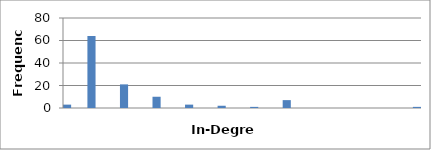
| Category | 3 |
|---|---|
| 0.0 | 3 |
| 0.2558139534883721 | 0 |
| 0.5116279069767442 | 0 |
| 0.7674418604651163 | 64 |
| 1.0232558139534884 | 0 |
| 1.2790697674418605 | 0 |
| 1.5348837209302326 | 0 |
| 1.7906976744186047 | 21 |
| 2.046511627906977 | 0 |
| 2.302325581395349 | 0 |
| 2.558139534883721 | 0 |
| 2.813953488372093 | 10 |
| 3.0697674418604652 | 0 |
| 3.3255813953488373 | 0 |
| 3.5813953488372094 | 0 |
| 3.8372093023255816 | 3 |
| 4.093023255813954 | 0 |
| 4.348837209302326 | 0 |
| 4.604651162790699 | 0 |
| 4.860465116279071 | 2 |
| 5.116279069767444 | 0 |
| 5.372093023255816 | 0 |
| 5.627906976744189 | 0 |
| 5.8837209302325615 | 1 |
| 6.139534883720934 | 0 |
| 6.395348837209307 | 0 |
| 6.651162790697679 | 0 |
| 6.906976744186052 | 7 |
| 7.162790697674424 | 0 |
| 7.418604651162797 | 0 |
| 7.674418604651169 | 0 |
| 7.930232558139542 | 0 |
| 8.186046511627914 | 0 |
| 8.441860465116287 | 0 |
| 8.69767441860466 | 0 |
| 8.953488372093032 | 0 |
| 9.209302325581405 | 0 |
| 9.465116279069777 | 0 |
| 9.72093023255815 | 0 |
| 9.976744186046522 | 0 |
| 10.232558139534895 | 0 |
| 10.488372093023267 | 0 |
| 10.74418604651164 | 0 |
| 11.0 | 1 |